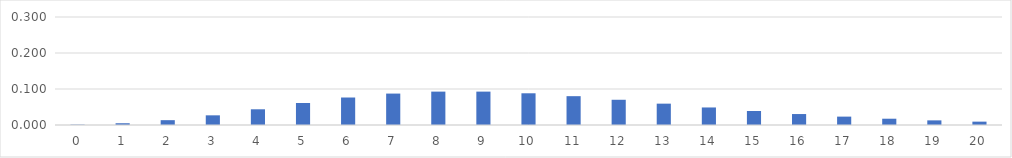
| Category | Series 0 |
|---|---|
| 0.0 | 0.001 |
| 1.0 | 0.005 |
| 2.0 | 0.013 |
| 3.0 | 0.027 |
| 4.0 | 0.044 |
| 5.0 | 0.061 |
| 6.0 | 0.076 |
| 7.0 | 0.087 |
| 8.0 | 0.093 |
| 9.0 | 0.093 |
| 10.0 | 0.088 |
| 11.0 | 0.08 |
| 12.0 | 0.07 |
| 13.0 | 0.059 |
| 14.0 | 0.049 |
| 15.0 | 0.039 |
| 16.0 | 0.03 |
| 17.0 | 0.023 |
| 18.0 | 0.017 |
| 19.0 | 0.013 |
| 20.0 | 0.009 |